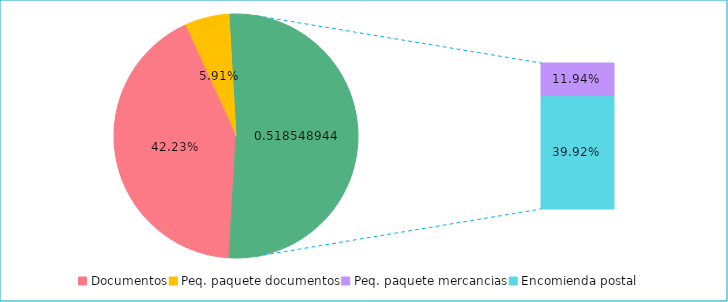
| Category | Series 0 |
|---|---|
| Documentos | 0.422 |
| Peq. paquete documentos | 0.059 |
| Peq. paquete mercancias | 0.119 |
| Encomienda postal | 0.399 |